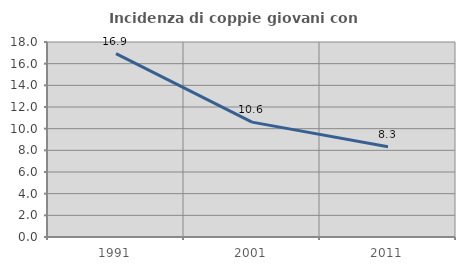
| Category | Incidenza di coppie giovani con figli |
|---|---|
| 1991.0 | 16.929 |
| 2001.0 | 10.606 |
| 2011.0 | 8.333 |